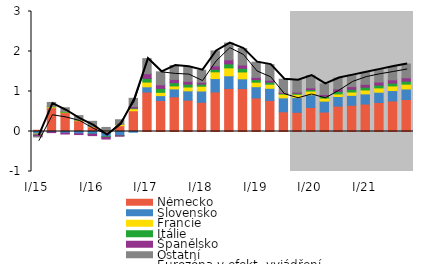
| Category | Německo | Slovensko | Francie | Itálie | Španělsko | Ostatní |
|---|---|---|---|---|---|---|
| I/15 | 0.031 | -0.064 | -0.016 | -0.007 | -0.042 | -0.005 |
| II | 0.595 | -0.015 | 0.022 | 0.007 | -0.013 | 0.103 |
| III | 0.472 | -0.042 | 0.009 | 0.017 | -0.021 | 0.096 |
| IV | 0.27 | -0.058 | 0.015 | 0.01 | -0.019 | 0.102 |
| I/16 | 0.117 | -0.067 | 0.007 | -0.002 | -0.034 | 0.131 |
| II | -0.038 | -0.091 | 0.007 | -0.016 | -0.044 | 0.095 |
| III | 0.144 | -0.101 | 0.031 | -0.005 | -0.011 | 0.118 |
| IV | 0.518 | -0.017 | 0.052 | 0.015 | 0.036 | 0.208 |
| I/17 | 0.987 | 0.131 | 0.118 | 0.09 | 0.118 | 0.379 |
| II | 0.774 | 0.123 | 0.082 | 0.1 | 0.089 | 0.324 |
| III | 0.867 | 0.198 | 0.074 | 0.083 | 0.081 | 0.348 |
| IV | 0.783 | 0.233 | 0.097 | 0.072 | 0.07 | 0.364 |
| I/18 | 0.729 | 0.284 | 0.12 | 0.052 | 0.046 | 0.302 |
| II | 0.99 | 0.334 | 0.168 | 0.062 | 0.084 | 0.375 |
| III | 1.076 | 0.317 | 0.199 | 0.1 | 0.101 | 0.418 |
| IV | 1.072 | 0.245 | 0.172 | 0.092 | 0.082 | 0.411 |
| I/19 | 0.839 | 0.28 | 0.113 | 0.065 | 0.055 | 0.38 |
| II | 0.777 | 0.303 | 0.103 | 0.051 | 0.049 | 0.39 |
| III | 0.493 | 0.347 | 0.094 | 0.018 | 0.02 | 0.334 |
| IV | 0.479 | 0.368 | 0.082 | 0.027 | 0.029 | 0.299 |
| I/20 | 0.602 | 0.318 | 0.091 | 0.037 | 0.043 | 0.309 |
| II | 0.486 | 0.274 | 0.075 | 0.045 | 0.044 | 0.267 |
| III | 0.635 | 0.24 | 0.065 | 0.062 | 0.062 | 0.274 |
| IV | 0.655 | 0.249 | 0.085 | 0.067 | 0.066 | 0.288 |
| I/21 | 0.687 | 0.254 | 0.098 | 0.068 | 0.071 | 0.303 |
| II | 0.724 | 0.258 | 0.108 | 0.069 | 0.076 | 0.318 |
| III | 0.764 | 0.26 | 0.116 | 0.071 | 0.081 | 0.332 |
| IV | 0.8 | 0.262 | 0.121 | 0.075 | 0.084 | 0.345 |